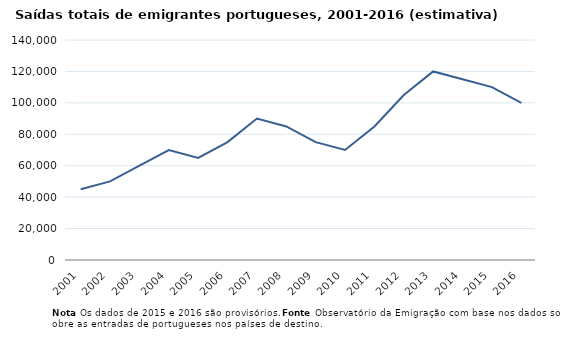
| Category | Saidas |
|---|---|
| 2001.0 | 45000 |
| 2002.0 | 50000 |
| 2003.0 | 60000 |
| 2004.0 | 70000 |
| 2005.0 | 65000 |
| 2006.0 | 75000 |
| 2007.0 | 90000 |
| 2008.0 | 85000 |
| 2009.0 | 75000 |
| 2010.0 | 70000 |
| 2011.0 | 85000 |
| 2012.0 | 105000 |
| 2013.0 | 120000 |
| 2014.0 | 115000 |
| 2015.0 | 110000 |
| 2016.0 | 100000 |